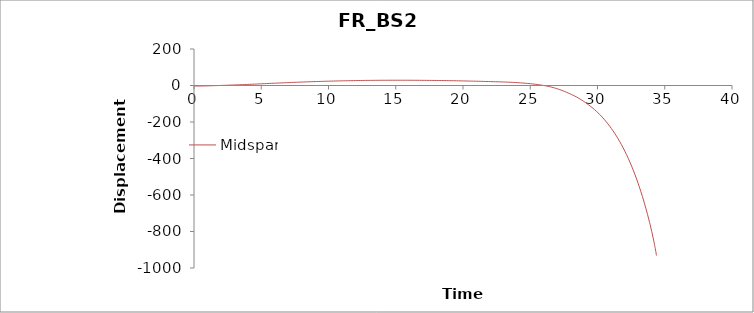
| Category | Midspan |
|---|---|
| 0.0 | -3.166 |
| 0.125 | -3.063 |
| 0.25 | -2.959 |
| 0.375 | -2.855 |
| 0.5 | -2.751 |
| 0.625 | -2.55 |
| 0.75 | -2.349 |
| 0.875 | -2.148 |
| 1.0 | -1.945 |
| 1.125 | -1.685 |
| 1.25 | -1.424 |
| 1.375 | -1.163 |
| 1.5 | -0.9 |
| 1.625 | -0.598 |
| 1.75 | -0.294 |
| 1.875 | 0.01 |
| 2.0 | 0.316 |
| 2.125 | 0.65 |
| 2.25 | 0.984 |
| 2.375 | 1.318 |
| 2.5 | 1.653 |
| 2.625 | 1.948 |
| 2.75 | 2.244 |
| 2.875 | 2.541 |
| 3.0 | 2.839 |
| 3.125 | 3.211 |
| 3.25 | 3.584 |
| 3.375 | 3.959 |
| 3.5 | 4.336 |
| 3.625 | 4.724 |
| 3.75 | 5.113 |
| 3.875 | 5.504 |
| 4.0 | 5.897 |
| 4.125 | 6.294 |
| 4.25 | 6.69 |
| 4.375 | 7.088 |
| 4.5 | 7.487 |
| 4.625 | 7.957 |
| 4.75 | 8.429 |
| 4.875 | 8.904 |
| 5.0 | 9.38 |
| 5.125 | 9.788 |
| 5.25 | 10.198 |
| 5.375 | 10.609 |
| 5.5 | 11.021 |
| 5.625 | 11.43 |
| 5.75 | 11.838 |
| 5.875 | 12.243 |
| 6.0 | 12.65 |
| 6.125 | 13.051 |
| 6.25 | 13.452 |
| 6.375 | 13.855 |
| 6.5 | 14.259 |
| 6.625 | 14.653 |
| 6.75 | 15.048 |
| 6.875 | 15.444 |
| 7.0 | 15.841 |
| 7.125 | 16.226 |
| 7.25 | 16.612 |
| 7.375 | 16.999 |
| 7.5 | 17.384 |
| 7.625 | 17.744 |
| 7.75 | 18.104 |
| 7.875 | 18.465 |
| 8.0 | 18.826 |
| 8.125 | 19.161 |
| 8.25 | 19.497 |
| 8.375 | 19.832 |
| 8.5 | 20.168 |
| 8.625 | 20.503 |
| 8.75 | 20.839 |
| 8.875 | 21.174 |
| 9.0 | 21.508 |
| 9.125 | 21.782 |
| 9.25 | 22.056 |
| 9.375 | 22.329 |
| 9.5 | 22.602 |
| 9.625 | 22.874 |
| 9.75 | 23.131 |
| 9.875 | 23.384 |
| 10.0 | 23.635 |
| 10.125 | 23.875 |
| 10.25 | 24.113 |
| 10.375 | 24.35 |
| 10.5 | 24.584 |
| 10.625 | 24.816 |
| 10.75 | 25.046 |
| 10.875 | 25.273 |
| 11.0 | 25.497 |
| 11.125 | 25.688 |
| 11.25 | 25.877 |
| 11.375 | 26.063 |
| 11.5 | 26.247 |
| 11.625 | 26.428 |
| 11.75 | 26.606 |
| 11.875 | 26.781 |
| 12.0 | 26.952 |
| 12.125 | 27.096 |
| 12.25 | 27.236 |
| 12.375 | 27.374 |
| 12.5 | 27.509 |
| 12.625 | 27.634 |
| 12.75 | 27.754 |
| 12.875 | 27.869 |
| 13.0 | 27.98 |
| 13.125 | 28.07 |
| 13.25 | 28.156 |
| 13.375 | 28.239 |
| 13.5 | 28.318 |
| 13.625 | 28.393 |
| 13.75 | 28.465 |
| 13.875 | 28.532 |
| 14.0 | 28.594 |
| 14.125 | 28.638 |
| 14.25 | 28.679 |
| 14.375 | 28.715 |
| 14.5 | 28.748 |
| 14.625 | 28.777 |
| 14.75 | 28.801 |
| 14.875 | 28.821 |
| 15.0 | 28.835 |
| 15.125 | 28.834 |
| 15.25 | 28.83 |
| 15.375 | 28.821 |
| 15.5 | 28.808 |
| 15.625 | 28.791 |
| 15.75 | 28.768 |
| 15.875 | 28.741 |
| 16.0 | 28.708 |
| 16.125 | 28.662 |
| 16.25 | 28.613 |
| 16.375 | 28.559 |
| 16.5 | 28.501 |
| 16.625 | 28.437 |
| 16.65625 | 28.421 |
| 16.78125 | 28.35 |
| 16.90625 | 28.274 |
| 17.03125 | 28.19 |
| 17.15625 | 28.099 |
| 17.28125 | 28.004 |
| 17.40625 | 27.922 |
| 17.53125 | 27.844 |
| 17.65625 | 27.761 |
| 17.78125 | 27.674 |
| 17.90625 | 27.581 |
| 18.03125 | 27.481 |
| 18.15625 | 27.372 |
| 18.28125 | 27.259 |
| 18.40625 | 27.141 |
| 18.53125 | 27.017 |
| 18.65625 | 26.887 |
| 18.78125 | 26.751 |
| 18.90625 | 26.608 |
| 19.03125 | 26.456 |
| 19.15625 | 26.295 |
| 19.28125 | 26.131 |
| 19.40625 | 25.962 |
| 19.53125 | 25.789 |
| 19.65625 | 25.611 |
| 19.78125 | 25.428 |
| 19.90625 | 25.24 |
| 20.03125 | 25.046 |
| 20.15625 | 24.846 |
| 20.28125 | 24.643 |
| 20.40625 | 24.438 |
| 20.53125 | 24.229 |
| 20.65625 | 24.016 |
| 20.78125 | 23.8 |
| 20.90625 | 23.581 |
| 21.03125 | 23.357 |
| 21.15625 | 23.129 |
| 21.28125 | 22.899 |
| 21.40625 | 22.666 |
| 21.53125 | 22.43 |
| 21.65625 | 22.192 |
| 21.78125 | 21.95 |
| 21.90625 | 21.705 |
| 22.03125 | 21.457 |
| 22.15625 | 21.202 |
| 22.28125 | 20.941 |
| 22.40625 | 20.671 |
| 22.53125 | 20.392 |
| 22.65625 | 20.105 |
| 22.78125 | 19.809 |
| 22.90625 | 19.504 |
| 23.03125 | 19.188 |
| 23.15625 | 18.856 |
| 23.28125 | 18.507 |
| 23.40625 | 18.139 |
| 23.53125 | 17.752 |
| 23.65625 | 17.344 |
| 23.78125 | 16.82 |
| 23.90625 | 16.283 |
| 24.03125 | 15.713 |
| 24.15625 | 15.093 |
| 24.28125 | 14.437 |
| 24.40625 | 13.745 |
| 24.53125 | 13.014 |
| 24.65625 | 12.241 |
| 24.78125 | 11.424 |
| 24.90625 | 10.56 |
| 25.03125 | 9.643 |
| 25.15625 | 8.66 |
| 25.28125 | 7.615 |
| 25.40625 | 6.505 |
| 25.53125 | 5.326 |
| 25.65625 | 4.069 |
| 25.78125 | 2.712 |
| 25.90625 | 1.262 |
| 26.03125 | -0.283 |
| 26.0625 | -0.677 |
| 26.1875 | -2.398 |
| 26.3125 | -4.279 |
| 26.4375 | -6.333 |
| 26.5625 | -8.541 |
| 26.6875 | -10.905 |
| 26.8125 | -13.517 |
| 26.9375 | -16.308 |
| 27.0625 | -19.318 |
| 27.1875 | -22.459 |
| 27.3125 | -25.769 |
| 27.4375 | -29.311 |
| 27.5625 | -32.964 |
| 27.6875 | -36.719 |
| 27.8125 | -40.854 |
| 27.9375 | -44.771 |
| 28.0625 | -48.944 |
| 28.1875 | -53.348 |
| 28.3125 | -57.97 |
| 28.4375 | -62.901 |
| 28.5625 | -68.099 |
| 28.6875 | -73.564 |
| 28.8125 | -79.279 |
| 28.9375 | -85.277 |
| 28.96875 | -86.768 |
| 29.09375 | -92.918 |
| 29.21875 | -99.453 |
| 29.34375 | -106.264 |
| 29.375 | -107.954 |
| 29.5 | -115.005 |
| 29.53125 | -116.81 |
| 29.65625 | -124.261 |
| 29.78125 | -132.234 |
| 29.90625 | -140.541 |
| 30.03125 | -149.19 |
| 30.15625 | -158.249 |
| 30.28125 | -167.825 |
| 30.40625 | -177.878 |
| 30.53125 | -188.343 |
| 30.65625 | -199.288 |
| 30.78125 | -210.792 |
| 30.90625 | -222.853 |
| 31.03125 | -235.512 |
| 31.15625 | -248.664 |
| 31.28125 | -262.434 |
| 31.40625 | -276.826 |
| 31.53125 | -291.891 |
| 31.65625 | -307.682 |
| 31.78125 | -324.253 |
| 31.90625 | -341.6 |
| 32.03125 | -359.738 |
| 32.15625 | -378.679 |
| 32.28125 | -398.477 |
| 32.40625 | -419.206 |
| 32.53125 | -440.92 |
| 32.65625 | -463.643 |
| 32.78125 | -487.459 |
| 32.90625 | -512.447 |
| 33.03125 | -538.63 |
| 33.0625 | -545.238 |
| 33.09375 | -551.906 |
| 33.21875 | -579.858 |
| 33.34375 | -609.201 |
| 33.46875 | -640.032 |
| 33.59375 | -672.445 |
| 33.71875 | -706.558 |
| 33.720703125 | -707.087 |
| 33.845703125 | -742.696 |
| 33.876953125 | -751.82 |
| 33.908203125 | -761.052 |
| 34.033203125 | -800.179 |
| 34.041015625 | -802.628 |
| 34.048828125 | -805.087 |
| 34.056640625 | -807.555 |
| 34.064453125 | -810.034 |
| 34.072265625 | -812.524 |
| 34.197265625 | -856.309 |
| 34.205078125 | -859.072 |
| 34.236328125 | -870.508 |
| 34.267578125 | -882.385 |
| 34.275390625 | -885.382 |
| 34.283203125 | -888.411 |
| 34.291015625 | -891.47 |
| 34.298828125 | -894.559 |
| 34.306640625 | -897.68 |
| 34.337890625 | -910.754 |
| 34.369140625 | -924.541 |
| 34.376953125 | -928.034 |
| 34.384765625 | -931.589 |
| 34.38525390625 | -931.812 |